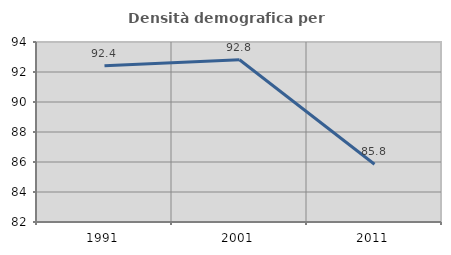
| Category | Densità demografica |
|---|---|
| 1991.0 | 92.409 |
| 2001.0 | 92.819 |
| 2011.0 | 85.85 |